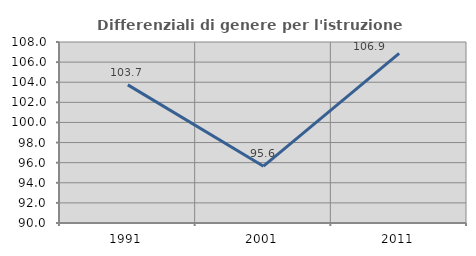
| Category | Differenziali di genere per l'istruzione superiore |
|---|---|
| 1991.0 | 103.738 |
| 2001.0 | 95.649 |
| 2011.0 | 106.874 |